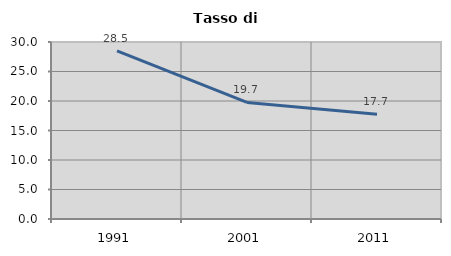
| Category | Tasso di disoccupazione   |
|---|---|
| 1991.0 | 28.508 |
| 2001.0 | 19.749 |
| 2011.0 | 17.744 |